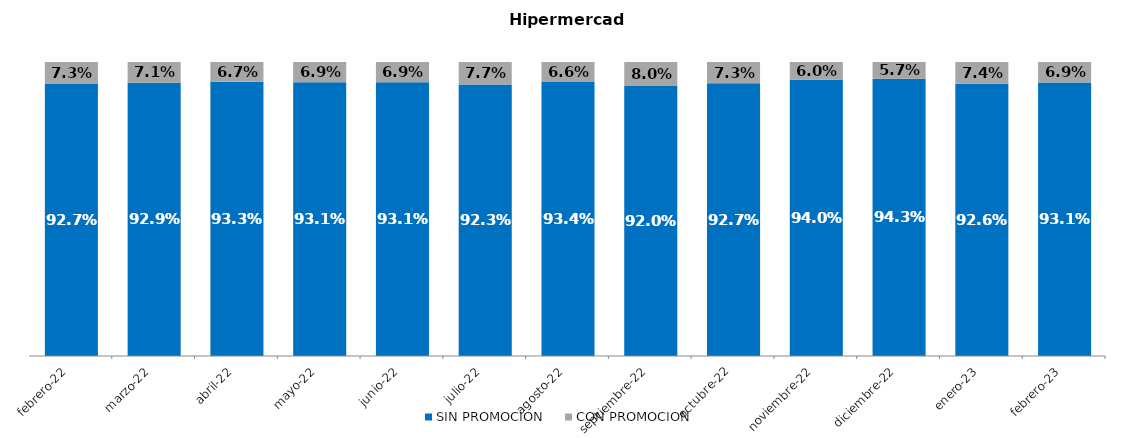
| Category | SIN PROMOCION   | CON PROMOCION   |
|---|---|---|
| 2022-02-01 | 0.927 | 0.073 |
| 2022-03-01 | 0.929 | 0.071 |
| 2022-04-01 | 0.933 | 0.067 |
| 2022-05-01 | 0.931 | 0.069 |
| 2022-06-01 | 0.931 | 0.069 |
| 2022-07-01 | 0.923 | 0.077 |
| 2022-08-01 | 0.934 | 0.066 |
| 2022-09-01 | 0.92 | 0.08 |
| 2022-10-01 | 0.927 | 0.073 |
| 2022-11-01 | 0.94 | 0.06 |
| 2022-12-01 | 0.943 | 0.057 |
| 2023-01-01 | 0.926 | 0.074 |
| 2023-02-01 | 0.931 | 0.069 |